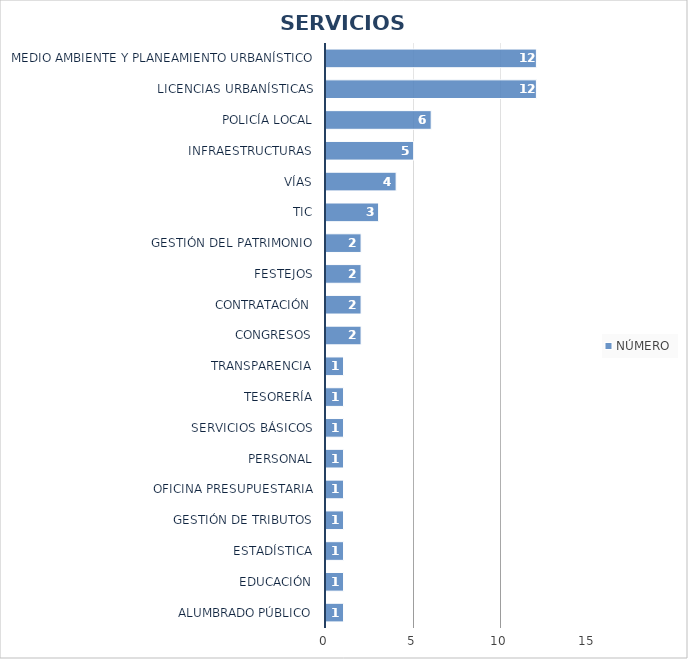
| Category | NÚMERO |
|---|---|
| Alumbrado público | 1 |
| Educación | 1 |
| Estadística | 1 |
| Gestión de Tributos | 1 |
| Oficina Presupuestaria | 1 |
| Personal | 1 |
| Servicios Básicos | 1 |
| Tesorería | 1 |
| Transparencia | 1 |
| Congresos | 2 |
| Contratación | 2 |
| Festejos | 2 |
| Gestión del Patrimonio | 2 |
| TIC | 3 |
| Vías | 4 |
| Infraestructuras | 5 |
| Policía Local | 6 |
| Licencias Urbanísticas | 12 |
| Medio Ambiente y Planeamiento Urbanístico | 12 |